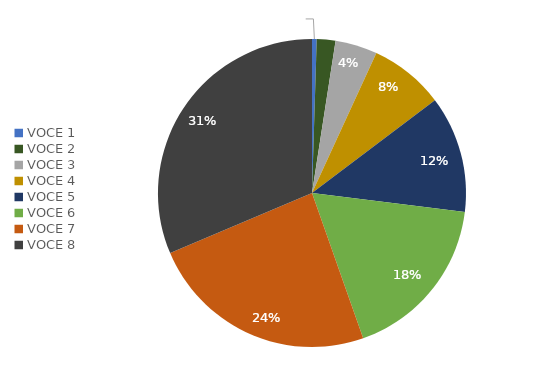
| Category | Series 0 | Series 1 |
|---|---|---|
| VOCE 1 | 0.005 | 0.005 |
| VOCE 2 | 0.02 | 0.02 |
| VOCE 3 | 0.044 | 0.044 |
| VOCE 4 | 0.078 | 0.078 |
| VOCE 5 | 0.123 | 0.123 |
| VOCE 6 | 0.176 | 0.176 |
| VOCE 7 | 0.24 | 0.24 |
| VOCE 8 | 0.314 | 0.314 |